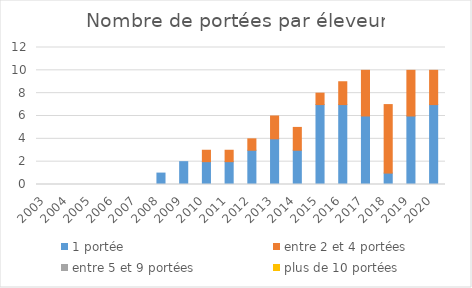
| Category | 1 portée | entre 2 et 4 portées | entre 5 et 9 portées | plus de 10 portées |
|---|---|---|---|---|
| 2003.0 | 0 | 0 | 0 | 0 |
| 2004.0 | 0 | 0 | 0 | 0 |
| 2005.0 | 0 | 0 | 0 | 0 |
| 2006.0 | 0 | 0 | 0 | 0 |
| 2007.0 | 0 | 0 | 0 | 0 |
| 2008.0 | 1 | 0 | 0 | 0 |
| 2009.0 | 2 | 0 | 0 | 0 |
| 2010.0 | 2 | 1 | 0 | 0 |
| 2011.0 | 2 | 1 | 0 | 0 |
| 2012.0 | 3 | 1 | 0 | 0 |
| 2013.0 | 4 | 2 | 0 | 0 |
| 2014.0 | 3 | 2 | 0 | 0 |
| 2015.0 | 7 | 1 | 0 | 0 |
| 2016.0 | 7 | 2 | 0 | 0 |
| 2017.0 | 6 | 4 | 0 | 0 |
| 2018.0 | 1 | 6 | 0 | 0 |
| 2019.0 | 6 | 4 | 0 | 0 |
| 2020.0 | 7 | 3 | 0 | 0 |